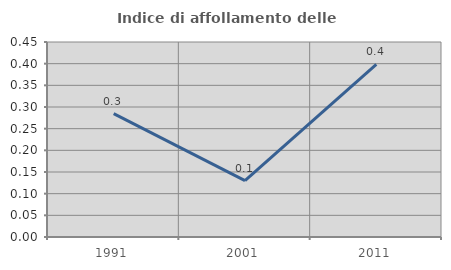
| Category | Indice di affollamento delle abitazioni  |
|---|---|
| 1991.0 | 0.285 |
| 2001.0 | 0.13 |
| 2011.0 | 0.399 |